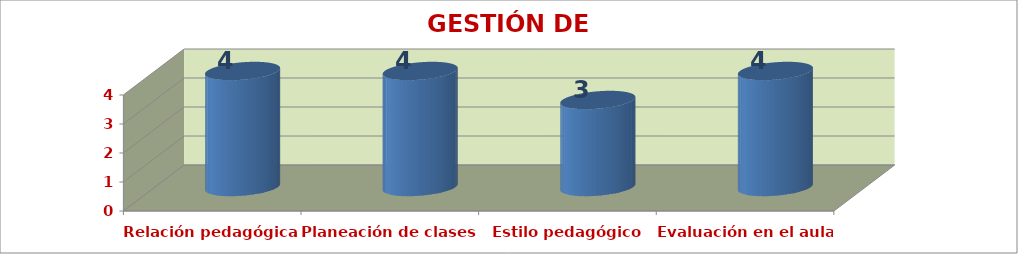
| Category | GESTIÓN DE AULA |
|---|---|
| Relación pedagógica | 4 |
| Planeación de clases | 4 |
| Estilo pedagógico | 3 |
| Evaluación en el aula | 4 |